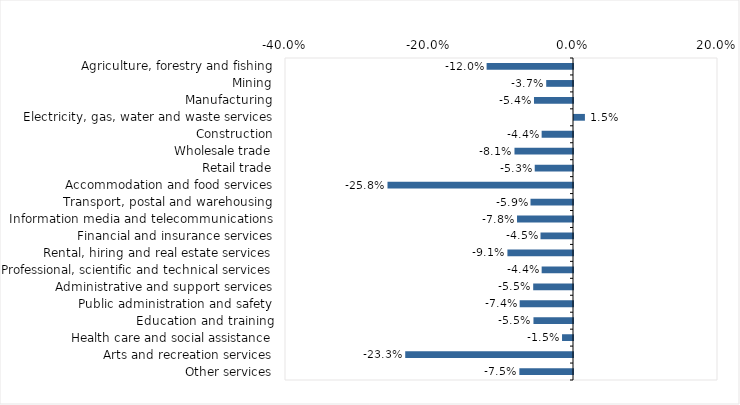
| Category | This week |
|---|---|
| Agriculture, forestry and fishing | -0.12 |
| Mining | -0.037 |
| Manufacturing | -0.054 |
| Electricity, gas, water and waste services | 0.015 |
| Construction | -0.044 |
| Wholesale trade | -0.081 |
| Retail trade | -0.053 |
| Accommodation and food services | -0.258 |
| Transport, postal and warehousing | -0.059 |
| Information media and telecommunications | -0.078 |
| Financial and insurance services | -0.045 |
| Rental, hiring and real estate services | -0.091 |
| Professional, scientific and technical services | -0.044 |
| Administrative and support services | -0.055 |
| Public administration and safety | -0.074 |
| Education and training | -0.055 |
| Health care and social assistance | -0.015 |
| Arts and recreation services | -0.233 |
| Other services | -0.075 |